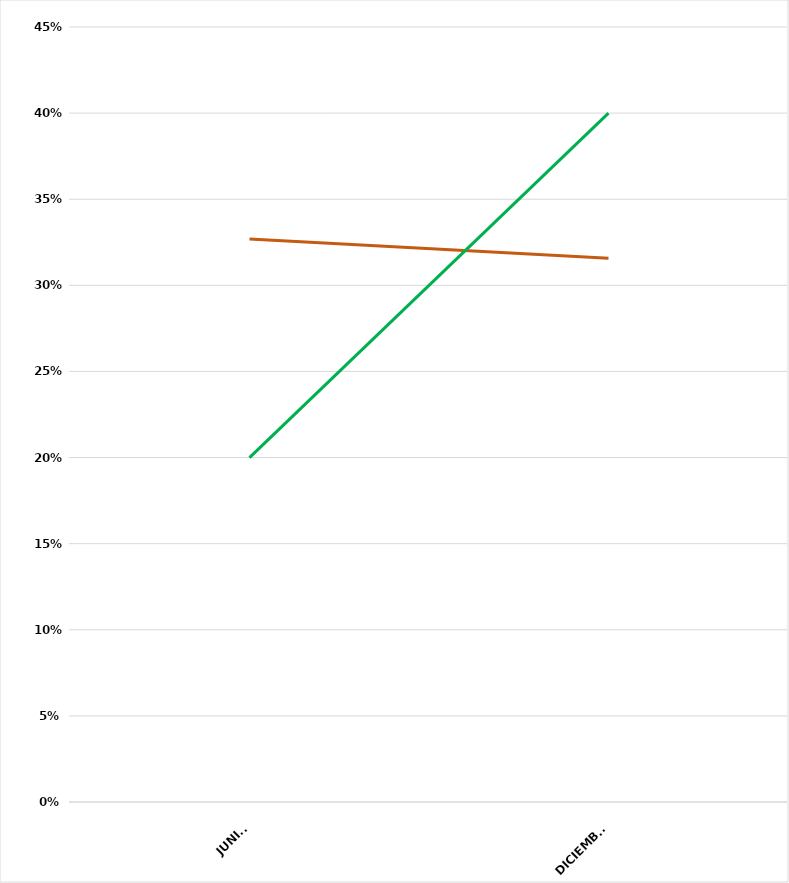
| Category | VALOR  | META PONDERADA |
|---|---|---|
| JUNIO | 0.327 | 0.2 |
| DICIEMBRE | 0.316 | 0.4 |